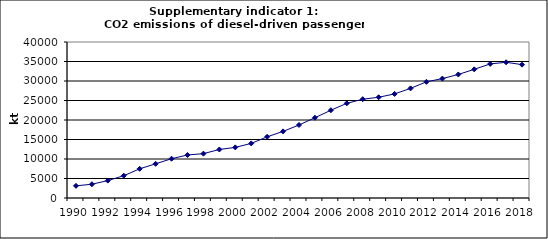
| Category | CO2 emissions of diesel-driven passenger cars, kt |
|---|---|
| 1990 | 3117.744 |
| 1991 | 3527.26 |
| 1992 | 4465.054 |
| 1993 | 5714.371 |
| 1994 | 7487.175 |
| 1995 | 8762.496 |
| 1996 | 10073.712 |
| 1997 | 11029.292 |
| 1998 | 11373.952 |
| 1999 | 12436.739 |
| 2000 | 12979.39 |
| 2001 | 13993.831 |
| 2002 | 15682.365 |
| 2003 | 17076.985 |
| 2004 | 18719.704 |
| 2005 | 20579.784 |
| 2006 | 22505.621 |
| 2007 | 24274.208 |
| 2008 | 25336.221 |
| 2009 | 25830.799 |
| 2010 | 26689.075 |
| 2011 | 28106.237 |
| 2012 | 29787.906 |
| 2013 | 30616.484 |
| 2014 | 31676.571 |
| 2015 | 32993.065 |
| 2016 | 34380.377 |
| 2017 | 34797.33 |
| 2018 | 34191.35 |